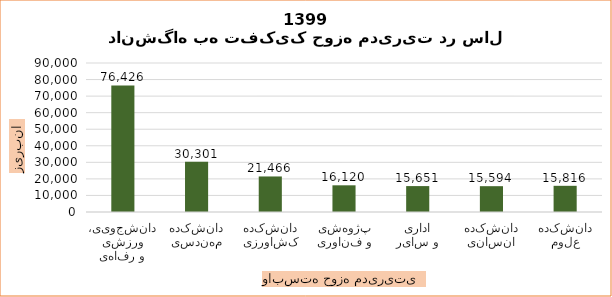
| Category | جمع کل |
|---|---|
| دانشجویی، ورزشی و رفاهی | 76425.6 |
| دانشکده مهندسی | 30301.4 |
| دانشکده کشاورزی | 21466 |
| پژوهشی و فناوری | 16120 |
| اداری و سایر | 15650.6 |
| دانشکده انسانی | 15594 |
| دانشکده علوم | 15816 |